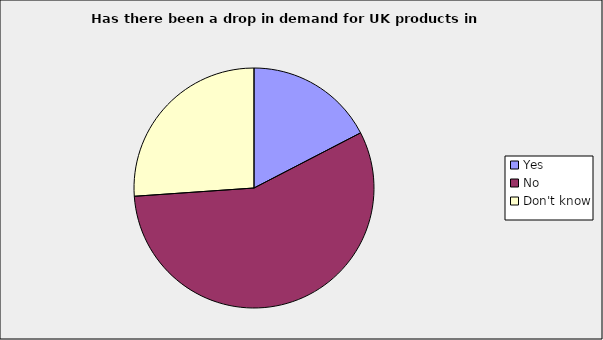
| Category | Series 0 |
|---|---|
| Yes | 0.174 |
| No  | 0.565 |
| Don't know | 0.261 |